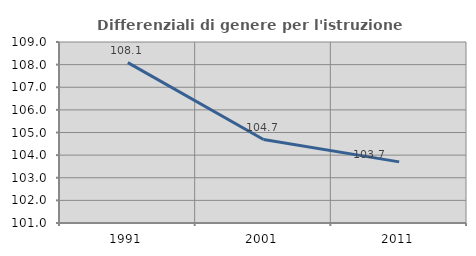
| Category | Differenziali di genere per l'istruzione superiore |
|---|---|
| 1991.0 | 108.088 |
| 2001.0 | 104.69 |
| 2011.0 | 103.701 |